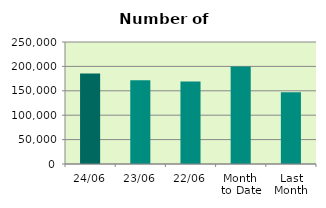
| Category | Series 0 |
|---|---|
| 24/06 | 185462 |
| 23/06 | 171768 |
| 22/06 | 168810 |
| Month 
to Date | 199943.667 |
| Last
Month | 147277.8 |